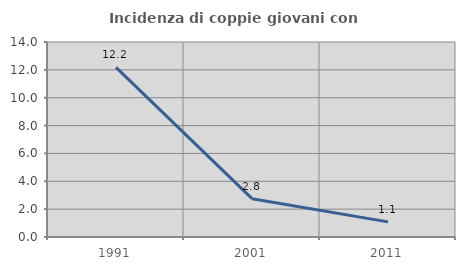
| Category | Incidenza di coppie giovani con figli |
|---|---|
| 1991.0 | 12.174 |
| 2001.0 | 2.752 |
| 2011.0 | 1.087 |